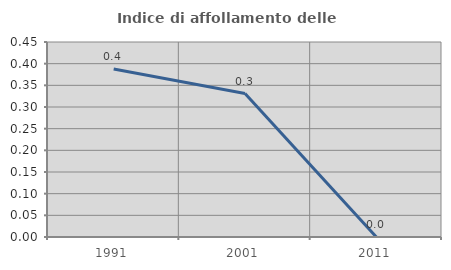
| Category | Indice di affollamento delle abitazioni  |
|---|---|
| 1991.0 | 0.388 |
| 2001.0 | 0.331 |
| 2011.0 | 0 |